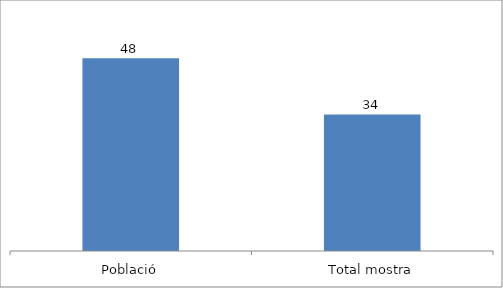
| Category | Series 0 |
|---|---|
| Població | 48 |
| Total mostra | 34 |